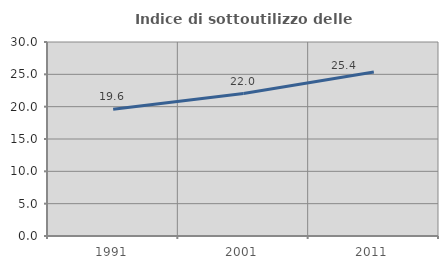
| Category | Indice di sottoutilizzo delle abitazioni  |
|---|---|
| 1991.0 | 19.586 |
| 2001.0 | 22.03 |
| 2011.0 | 25.359 |